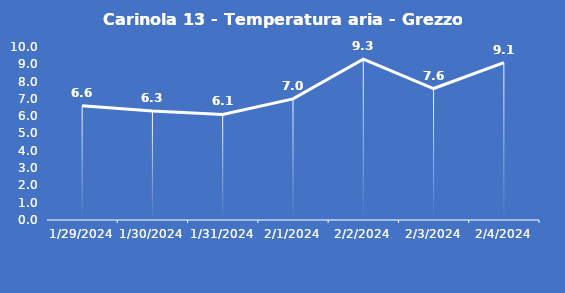
| Category | Carinola 13 - Temperatura aria - Grezzo (°C) |
|---|---|
| 1/29/24 | 6.6 |
| 1/30/24 | 6.3 |
| 1/31/24 | 6.1 |
| 2/1/24 | 7 |
| 2/2/24 | 9.3 |
| 2/3/24 | 7.6 |
| 2/4/24 | 9.1 |